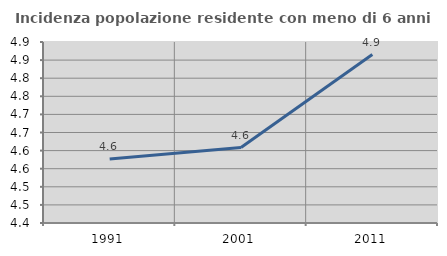
| Category | Incidenza popolazione residente con meno di 6 anni |
|---|---|
| 1991.0 | 4.577 |
| 2001.0 | 4.609 |
| 2011.0 | 4.865 |